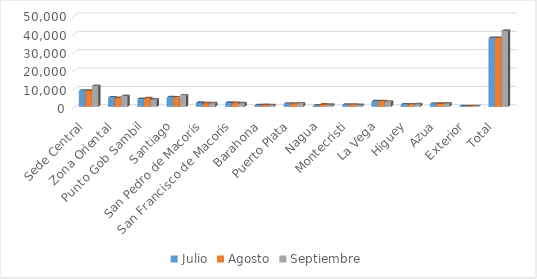
| Category | Julio | Agosto | Septiembre |
|---|---|---|---|
| Sede Central | 8733 | 8624 | 11315 |
| Zona Oriental | 5051 | 4712 | 5780 |
| Punto Gob Sambil | 4225 | 4568 | 3921 |
| Santiago | 5071 | 5024 | 6122 |
| San Pedro de Macorís | 2079 | 1871 | 1855 |
| San Francisco de Macorís | 2069 | 1944 | 1874 |
| Barahona | 775 | 894 | 707 |
| Puerto Plata | 1651 | 1642 | 1753 |
| Nagua | 644 | 1157 | 1061 |
| Montecristi | 1078 | 1077 | 971 |
| La Vega | 2918 | 2880 | 2708 |
| Higuey | 1219 | 1238 | 1313 |
| Azua | 1635 | 1570 | 1657 |
| Exterior | 211 | 223 | 256 |
| Total | 37359 | 37424 | 41293 |